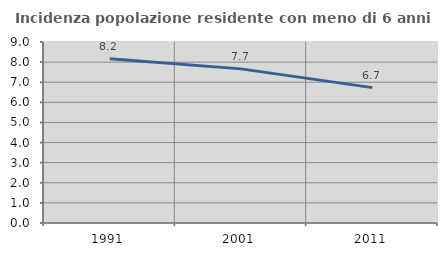
| Category | Incidenza popolazione residente con meno di 6 anni |
|---|---|
| 1991.0 | 8.169 |
| 2001.0 | 7.664 |
| 2011.0 | 6.732 |